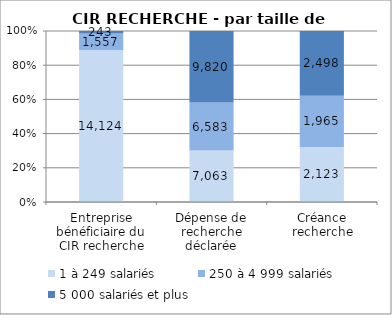
| Category | 1 à 249 salariés | 250 à 4 999 salariés | 5 000 salariés et plus |
|---|---|---|---|
| Entreprise bénéficiaire du CIR recherche | 14124 | 1557 | 243 |
| Dépense de recherche déclarée | 7062.52 | 6582.71 | 9819.53 |
| Créance recherche | 2122.87 | 1964.88 | 2497.72 |